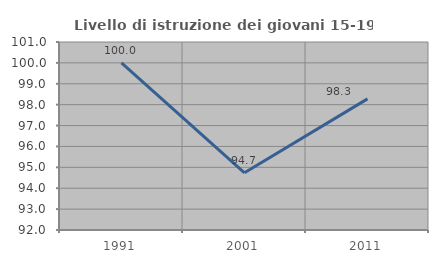
| Category | Livello di istruzione dei giovani 15-19 anni |
|---|---|
| 1991.0 | 100 |
| 2001.0 | 94.737 |
| 2011.0 | 98.276 |